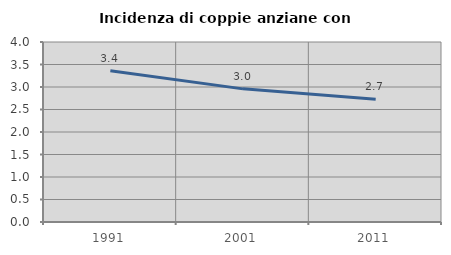
| Category | Incidenza di coppie anziane con figli |
|---|---|
| 1991.0 | 3.359 |
| 2001.0 | 2.959 |
| 2011.0 | 2.725 |